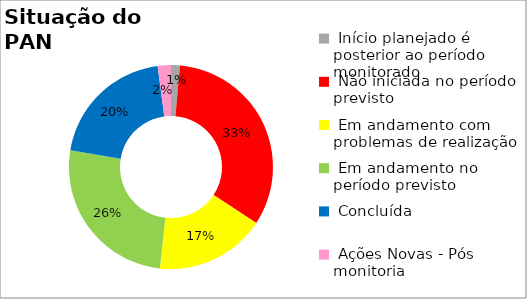
| Category | Series 0 |
|---|---|
|  Início planejado é posterior ao período monitorado | 0.014 |
|  Não iniciada no período previsto | 0.329 |
|  Em andamento com problemas de realização | 0.175 |
|  Em andamento no período previsto  | 0.259 |
|  Concluída | 0.203 |
|  Ações Novas - Pós monitoria | 0.021 |